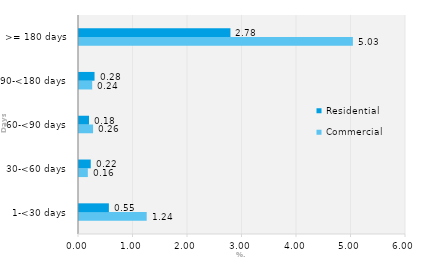
| Category | Commercial | Residential |
|---|---|---|
| 1-<30 days | 1.242 | 0.548 |
| 30-<60 days | 0.162 | 0.215 |
| 60-<90 days | 0.258 | 0.183 |
| 90-<180 days | 0.242 | 0.285 |
| >= 180 days | 5.025 | 2.778 |